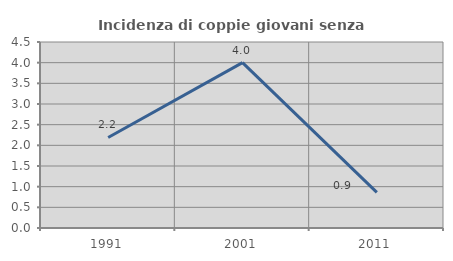
| Category | Incidenza di coppie giovani senza figli |
|---|---|
| 1991.0 | 2.19 |
| 2001.0 | 4 |
| 2011.0 | 0.862 |